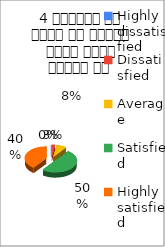
| Category | 4 शिक्षक ने विषय के प्रति रूचि रूचि जागृत की  |
|---|---|
| Highly dissatisfied | 0 |
| Dissatisfied | 1 |
| Average | 3 |
| Satisfied | 20 |
| Highly satisfied | 16 |